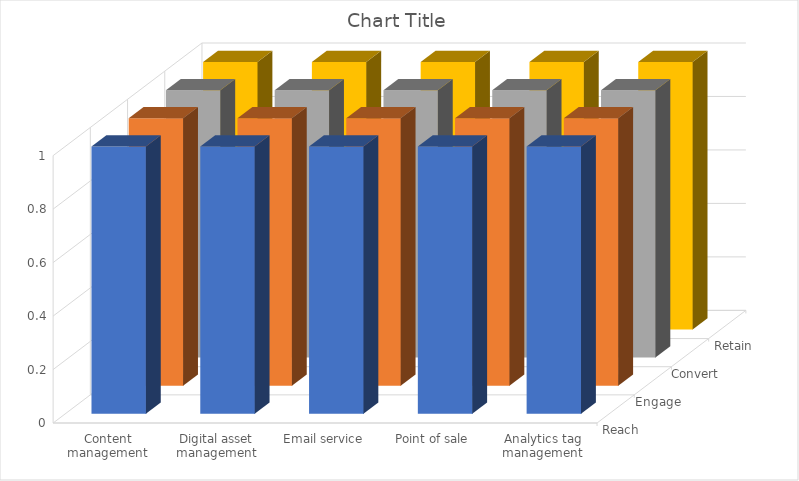
| Category | Reach | Engage | Convert | Retain |
|---|---|---|---|---|
| Content management | 1 | 1 | 1 | 1 |
| Digital asset management | 1 | 1 | 1 | 1 |
| Email service | 1 | 1 | 1 | 1 |
| Point of sale | 1 | 1 | 1 | 1 |
| Analytics tag management | 1 | 1 | 1 | 1 |